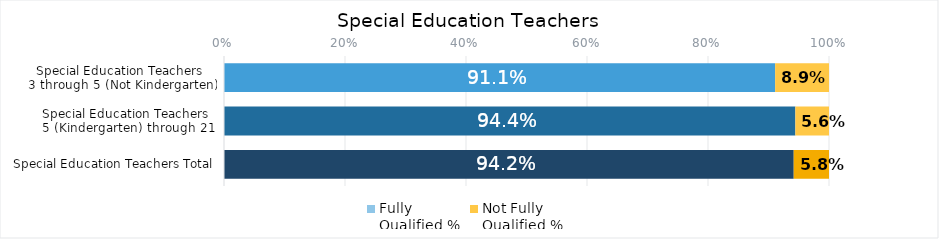
| Category | Fully
Qualified % | Not Fully 
Qualified %  |
|---|---|---|
| Special Education Teachers 
3 through 5 (Not Kindergarten) | 0.911 | 0.089 |
| Special Education Teachers 
5 (Kindergarten) through 21 | 0.944 | 0.056 |
| Special Education Teachers Total | 0.942 | 0.058 |